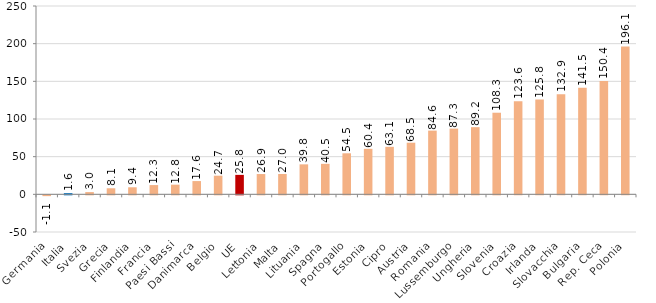
| Category | Series 0 |
|---|---|
| Germania | -1.061 |
| Italia | 1.59 |
| Svezia | 2.986 |
| Grecia | 8.065 |
| Finlandia | 9.366 |
| Francia | 12.296 |
| Paesi Bassi | 12.828 |
| Danimarca | 17.603 |
| Belgio | 24.728 |
| UE | 25.83 |
| Lettonia | 26.931 |
| Malta | 27.035 |
| Lituania | 39.804 |
| Spagna | 40.475 |
| Portogallo | 54.471 |
| Estonia | 60.419 |
| Cipro | 63.061 |
| Austria | 68.531 |
| Romania | 84.599 |
| Lussemburgo | 87.256 |
| Ungheria | 89.17 |
| Slovenia | 108.333 |
| Croazia | 123.619 |
| Irlanda | 125.757 |
| Slovacchia | 132.867 |
| Bulgaria | 141.529 |
| Rep. Ceca | 150.389 |
| Polonia | 196.146 |